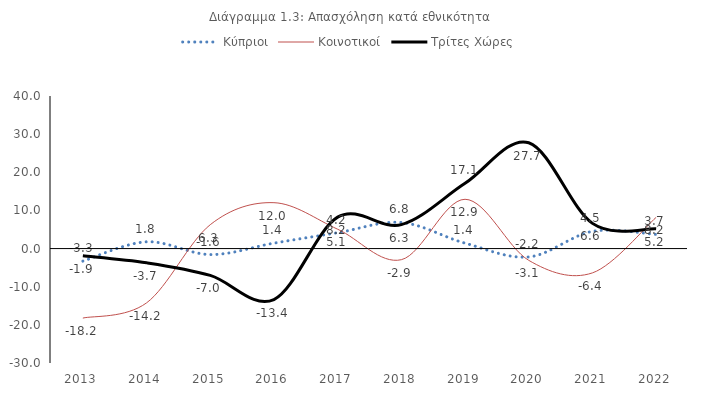
| Category | Κύπριοι | Κοινοτικοί | Τρίτες Χώρες |
|---|---|---|---|
| 2013.0 | -3.29 | -18.222 | -1.88 |
| 2014.0 | 1.775 | -14.237 | -3.719 |
| 2015.0 | -1.572 | 6.259 | -7.033 |
| 2016.0 | 1.417 | 12.032 | -13.366 |
| 2017.0 | 4.157 | 5.075 | 8.24 |
| 2018.0 | 6.843 | -2.918 | 6.279 |
| 2019.0 | 1.42 | 12.921 | 17.102 |
| 2020.0 | -2.196 | -3.089 | 27.743 |
| 2021.0 | 4.512 | -6.373 | 6.604 |
| 2022.0 | 3.715 | 8.185 | 5.199 |